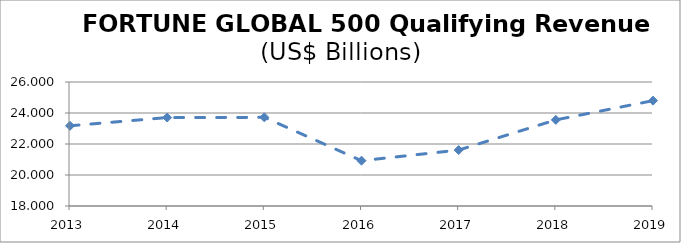
| Category | Series 0 |
|---|---|
| 2013.0 | 23.175 |
| 2014.0 | 23.706 |
| 2015.0 | 23.72 |
| 2016.0 | 20.923 |
| 2017.0 | 21.609 |
| 2018.0 | 23.556 |
| 2019.0 | 24.796 |